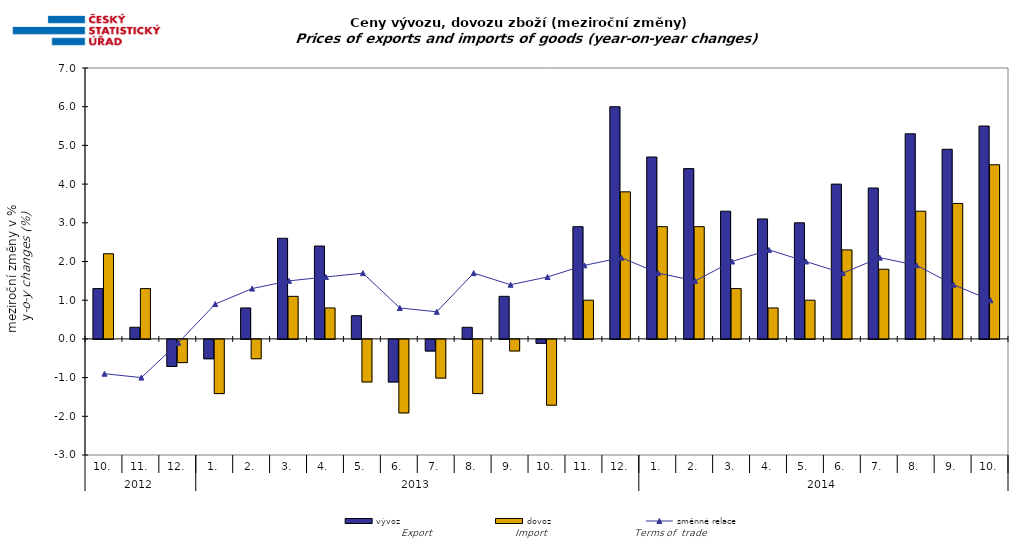
| Category | vývoz | dovoz |
|---|---|---|
| 0 | 1.3 | 2.2 |
| 1 | 0.3 | 1.3 |
| 2 | -0.7 | -0.6 |
| 3 | -0.5 | -1.4 |
| 4 | 0.8 | -0.5 |
| 5 | 2.6 | 1.1 |
| 6 | 2.4 | 0.8 |
| 7 | 0.6 | -1.1 |
| 8 | -1.1 | -1.9 |
| 9 | -0.3 | -1 |
| 10 | 0.3 | -1.4 |
| 11 | 1.1 | -0.3 |
| 12 | -0.1 | -1.7 |
| 13 | 2.9 | 1 |
| 14 | 6 | 3.8 |
| 15 | 4.7 | 2.9 |
| 16 | 4.4 | 2.9 |
| 17 | 3.3 | 1.3 |
| 18 | 3.1 | 0.8 |
| 19 | 3 | 1 |
| 20 | 4 | 2.3 |
| 21 | 3.9 | 1.8 |
| 22 | 5.3 | 3.3 |
| 23 | 4.9 | 3.5 |
| 24 | 5.5 | 4.5 |